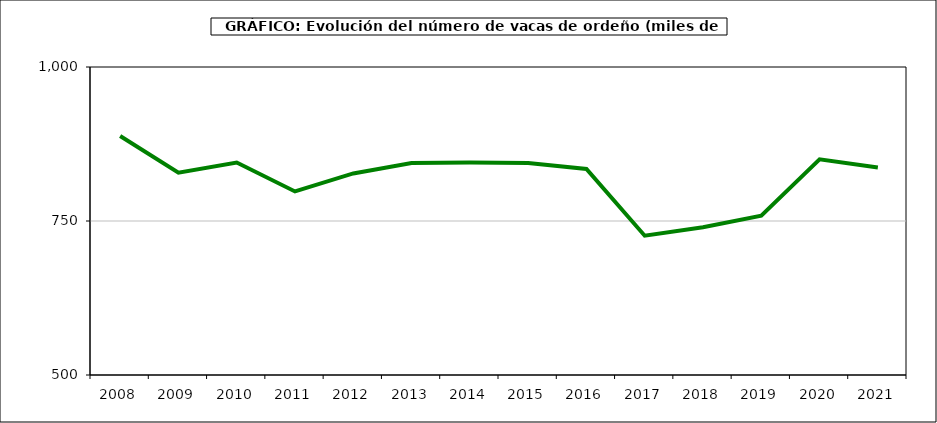
| Category | Leche de vaca |
|---|---|
| 2008.0 | 888 |
| 2009.0 | 828.347 |
| 2010.0 | 845 |
| 2011.0 | 798 |
| 2012.0 | 827.207 |
| 2013.0 | 844.06 |
| 2014.0 | 844.79 |
| 2015.0 | 844.114 |
| 2016.0 | 834.453 |
| 2017.0 | 726.131 |
| 2018.0 | 739.757 |
| 2019.0 | 758.569 |
| 2020.0 | 850.102 |
| 2021.0 | 836.965 |